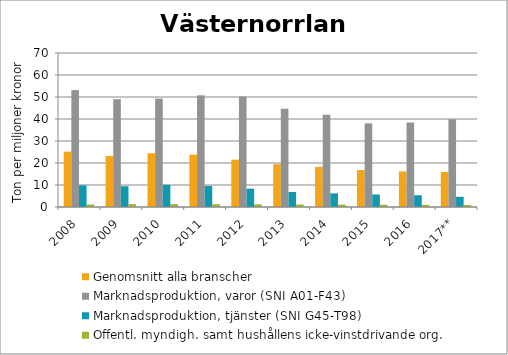
| Category | Genomsnitt alla branscher | Marknadsproduktion, varor (SNI A01-F43) | Marknadsproduktion, tjänster (SNI G45-T98) | Offentl. myndigh. samt hushållens icke-vinstdrivande org. |
|---|---|---|---|---|
| 2008 | 25.147 | 53.126 | 9.855 | 1.15 |
| 2009 | 23.205 | 48.99 | 9.452 | 1.316 |
| 2010 | 24.442 | 49.278 | 10.106 | 1.316 |
| 2011 | 23.777 | 50.767 | 9.576 | 1.277 |
| 2012 | 21.515 | 50.234 | 8.341 | 1.215 |
| 2013 | 19.436 | 44.612 | 6.843 | 1.137 |
| 2014 | 18.245 | 41.907 | 6.214 | 1.082 |
| 2015 | 16.776 | 37.998 | 5.681 | 1.049 |
| 2016 | 16.183 | 38.415 | 5.34 | 0.993 |
| 2017** | 15.944 | 39.866 | 4.637 | 0.929 |